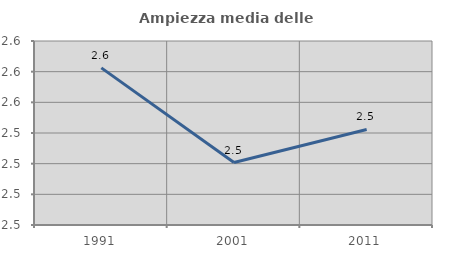
| Category | Ampiezza media delle famiglie |
|---|---|
| 1991.0 | 2.582 |
| 2001.0 | 2.521 |
| 2011.0 | 2.542 |